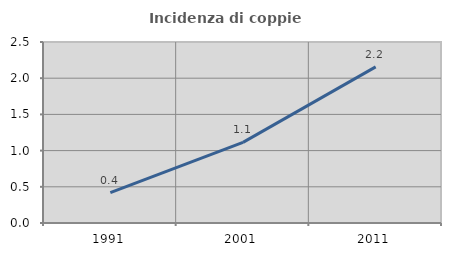
| Category | Incidenza di coppie miste |
|---|---|
| 1991.0 | 0.42 |
| 2001.0 | 1.114 |
| 2011.0 | 2.157 |